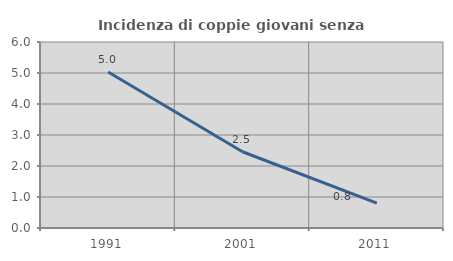
| Category | Incidenza di coppie giovani senza figli |
|---|---|
| 1991.0 | 5.031 |
| 2001.0 | 2.459 |
| 2011.0 | 0.8 |